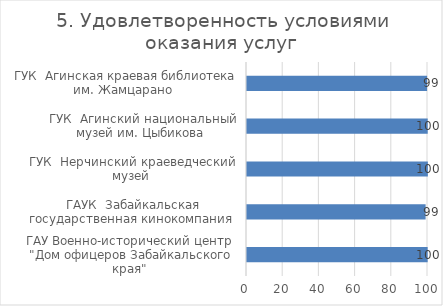
| Category | 5. Удовлетворенность условиями оказания услуг |
|---|---|
| ГАУ Военно-исторический центр  "Дом офицеров Забайкальского края"  | 99.813 |
| ГАУК  Забайкальская государственная кинокомпания  | 98.683 |
| ГУК  Нерчинский краеведческий музей  | 99.921 |
| ГУК  Агинский национальный музей им. Цыбикова  | 99.843 |
| ГУК  Агинская краевая библиотека им. Жамцарано  | 99.496 |